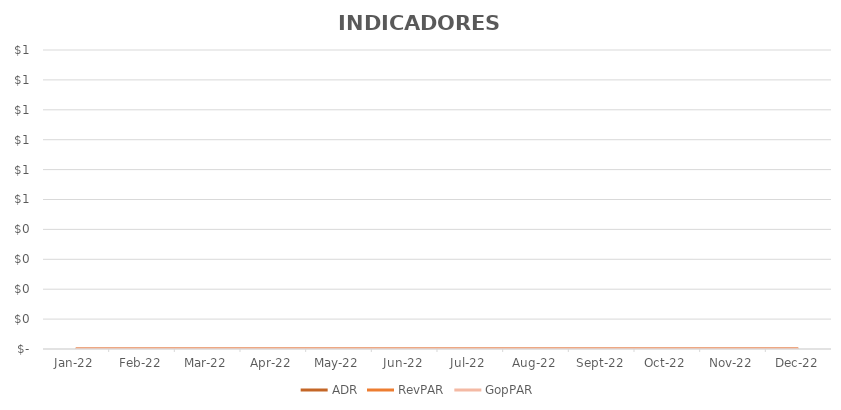
| Category | ADR | RevPAR | GopPAR |
|---|---|---|---|
| 2022-01-01 | 0 | 0 | 0 |
| 2022-02-01 | 0 | 0 | 0 |
| 2022-03-01 | 0 | 0 | 0 |
| 2022-04-01 | 0 | 0 | 0 |
| 2022-05-01 | 0 | 0 | 0 |
| 2022-06-01 | 0 | 0 | 0 |
| 2022-07-01 | 0 | 0 | 0 |
| 2022-08-01 | 0 | 0 | 0 |
| 2022-09-01 | 0 | 0 | 0 |
| 2022-10-01 | 0 | 0 | 0 |
| 2022-11-01 | 0 | 0 | 0 |
| 2022-12-01 | 0 | 0 | 0 |